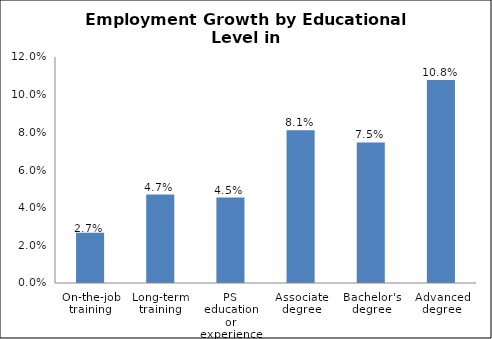
| Category | Series 0 |
|---|---|
| On-the-job training | 0.027 |
| Long-term training | 0.047 |
| PS education or experience | 0.045 |
| Associate degree | 0.081 |
| Bachelor's degree | 0.075 |
| Advanced degree | 0.108 |